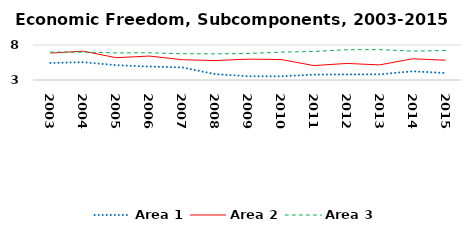
| Category | Area 1 | Area 2 | Area 3 |
|---|---|---|---|
| 2003.0 | 5.436 | 6.847 | 6.983 |
| 2004.0 | 5.542 | 7.115 | 6.991 |
| 2005.0 | 5.117 | 6.183 | 6.866 |
| 2006.0 | 4.92 | 6.421 | 6.889 |
| 2007.0 | 4.796 | 5.896 | 6.753 |
| 2008.0 | 3.84 | 5.777 | 6.731 |
| 2009.0 | 3.536 | 5.977 | 6.784 |
| 2010.0 | 3.523 | 5.927 | 6.983 |
| 2011.0 | 3.764 | 5.059 | 7.079 |
| 2012.0 | 3.802 | 5.367 | 7.324 |
| 2013.0 | 3.811 | 5.158 | 7.336 |
| 2014.0 | 4.244 | 6.033 | 7.129 |
| 2015.0 | 3.997 | 5.825 | 7.207 |